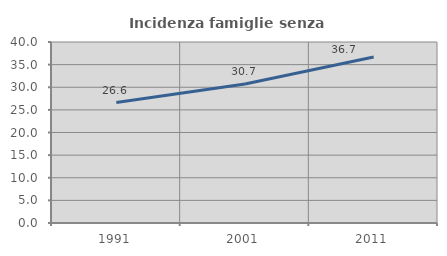
| Category | Incidenza famiglie senza nuclei |
|---|---|
| 1991.0 | 26.611 |
| 2001.0 | 30.707 |
| 2011.0 | 36.702 |